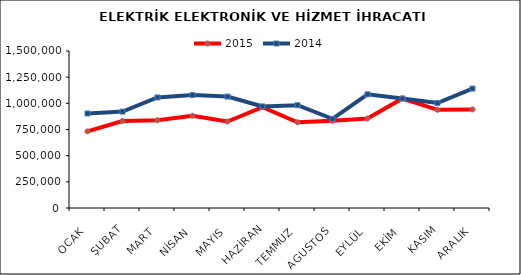
| Category | 2015 | 2014 |
|---|---|---|
| OCAK | 732040.448 | 902952.549 |
| ŞUBAT | 830885.281 | 921008.476 |
| MART | 838376.199 | 1056370.579 |
| NİSAN | 881106.121 | 1079057.335 |
| MAYIS | 826112.819 | 1064518.966 |
| HAZİRAN | 962560.303 | 970317.538 |
| TEMMUZ | 819122.074 | 982480.103 |
| AGUSTOS | 833226.863 | 851612.141 |
| EYLÜL | 854876.109 | 1086116.3 |
| EKİM | 1045961.102 | 1046417.034 |
| KASIM | 938357.753 | 1003275.655 |
| ARALIK | 941732.4 | 1140919.941 |